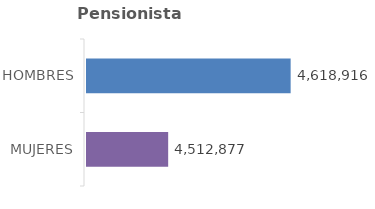
| Category | Series 0 | Series 1 |
|---|---|---|
| MUJERES | 4512877 |  |
| HOMBRES | 4618916 |  |